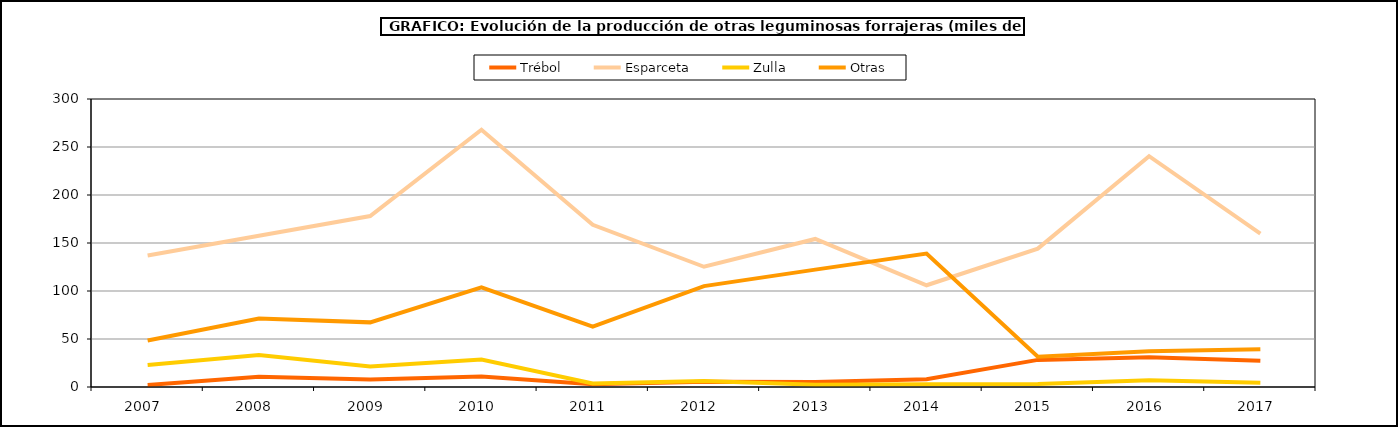
| Category | Trébol | Esparceta | Zulla | Otras |
|---|---|---|---|---|
| 2007.0 | 2.089 | 137.076 | 22.848 | 48.521 |
| 2008.0 | 10.657 | 157.588 | 33.339 | 71.318 |
| 2009.0 | 7.859 | 178.059 | 21.305 | 67.327 |
| 2010.0 | 10.903 | 268.016 | 28.537 | 103.706 |
| 2011.0 | 2.955 | 168.906 | 3.64 | 62.873 |
| 2012.0 | 5.531 | 125.242 | 6.24 | 105.056 |
| 2013.0 | 5.243 | 154.216 | 2.307 | 122.265 |
| 2014.0 | 8 | 105.99 | 2.813 | 139.025 |
| 2015.0 | 28.241 | 144.128 | 3.1 | 31.635 |
| 2016.0 | 30.989 | 240.408 | 6.945 | 37.171 |
| 2017.0 | 27.256 | 159.694 | 4.469 | 39.33 |